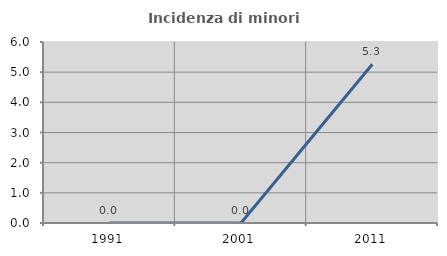
| Category | Incidenza di minori stranieri |
|---|---|
| 1991.0 | 0 |
| 2001.0 | 0 |
| 2011.0 | 5.263 |